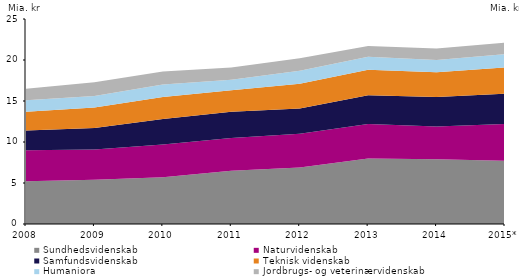
| Category | Sundhedsvidenskab | Naturvidenskab | Samfundsvidenskab | Teknisk videnskab | Humaniora | Jordbrugs- og veterinærvidenskab |
|---|---|---|---|---|---|---|
| 2008 | 5.2 | 3.8 | 2.4 | 2.3 | 1.4 | 1.4 |
| 2009 | 5.4 | 3.7 | 2.6 | 2.5 | 1.4 | 1.7 |
| 2010 | 5.7 | 4 | 3.1 | 2.7 | 1.5 | 1.6 |
| 2011 | 6.5 | 4 | 3.2 | 2.6 | 1.3 | 1.5 |
| 2012 | 6.9 | 4.1 | 3.1 | 3 | 1.6 | 1.5 |
| 2013 | 8 | 4.2 | 3.5 | 3.1 | 1.6 | 1.3 |
| 2014 | 7.9 | 4 | 3.6 | 3 | 1.5 | 1.4 |
| 2015* | 7.7 | 4.5 | 3.7 | 3.2 | 1.6 | 1.4 |